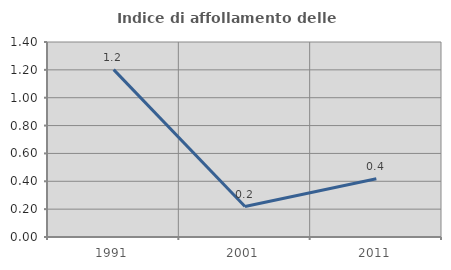
| Category | Indice di affollamento delle abitazioni  |
|---|---|
| 1991.0 | 1.202 |
| 2001.0 | 0.219 |
| 2011.0 | 0.418 |